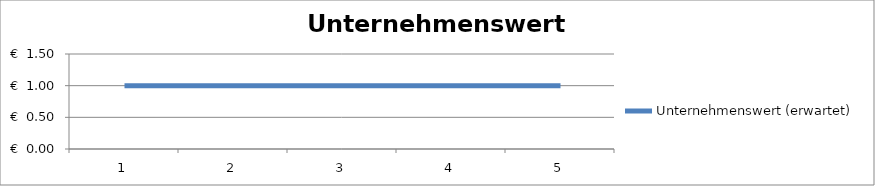
| Category | Unternehmenswert (erwartet) |
|---|---|
| 0 | 1 |
| 1 | 1 |
| 2 | 1 |
| 3 | 1 |
| 4 | 1 |